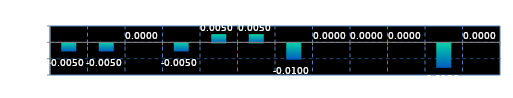
| Category | Series 0 |
|---|---|
| 0 | -0.005 |
| 1 | -0.005 |
| 2 | 0 |
| 3 | -0.005 |
| 4 | 0.005 |
| 5 | 0.005 |
| 6 | -0.01 |
| 7 | 0 |
| 8 | 0 |
| 9 | 0 |
| 10 | -0.015 |
| 11 | 0 |